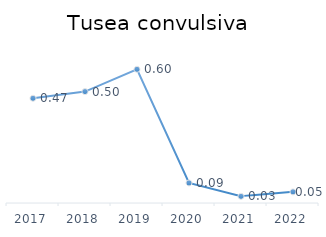
| Category | Series 0 |
|---|---|
| 2017.0 | 0.47 |
| 2018.0 | 0.5 |
| 2019.0 | 0.6 |
| 2020.0 | 0.09 |
| 2021.0 | 0.03 |
| 2022.0 | 0.05 |